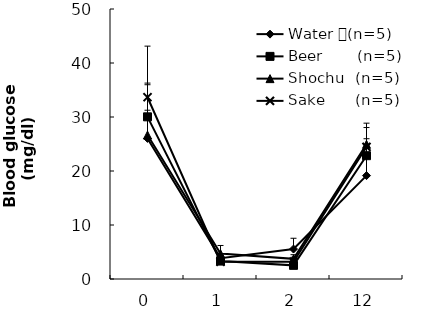
| Category | Water 　(n=5) | Beer       (n=5) | Shochu  (n=5) | Sake      (n=5) |
|---|---|---|---|---|
| 0.0 | 26.03 | 30.031 | 26.657 | 33.66 |
| 1.0 | 3.863 | 3.319 | 4.7 | 3.193 |
| 2.0 | 5.548 | 2.528 | 3.73 | 3.195 |
| 12.0 | 19.144 | 22.835 | 24.94 | 24.469 |